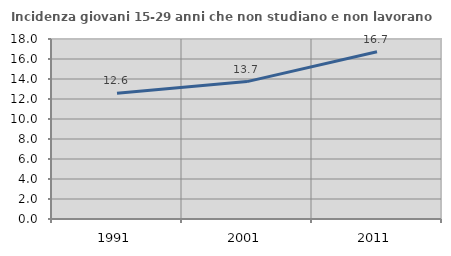
| Category | Incidenza giovani 15-29 anni che non studiano e non lavorano  |
|---|---|
| 1991.0 | 12.578 |
| 2001.0 | 13.74 |
| 2011.0 | 16.721 |